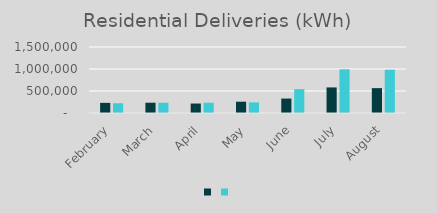
| Category | Series 1 | Series 0 |
|---|---|---|
| February | 230398 | 222078 |
| March | 233799 | 233000 |
| April | 215163 | 233112 |
| May | 256678 | 241101 |
| June | 328170 | 542054 |
| July | 581257 | 993126 |
| August | 565281 | 983202 |